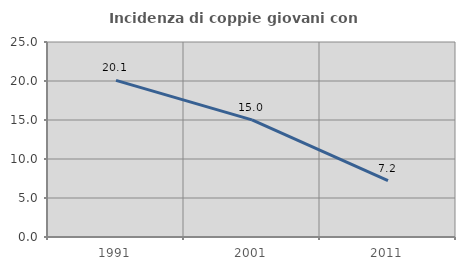
| Category | Incidenza di coppie giovani con figli |
|---|---|
| 1991.0 | 20.077 |
| 2001.0 | 15.016 |
| 2011.0 | 7.232 |